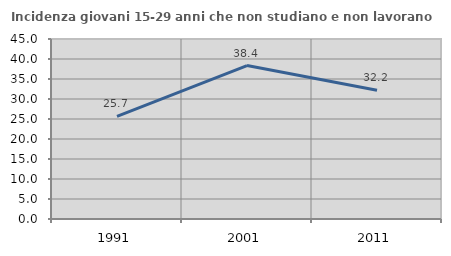
| Category | Incidenza giovani 15-29 anni che non studiano e non lavorano  |
|---|---|
| 1991.0 | 25.658 |
| 2001.0 | 38.361 |
| 2011.0 | 32.192 |